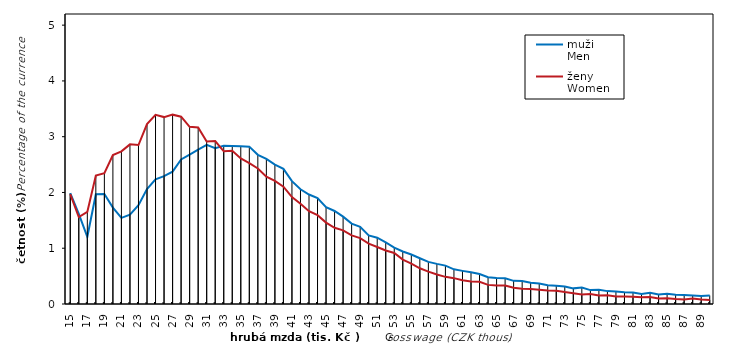
| Category | muži 
Men | ženy
Women |
|---|---|---|
| 15.0 | 1.989 | 1.971 |
| 16.0 | 1.617 | 1.56 |
| 17.0 | 1.205 | 1.65 |
| 18.0 | 1.969 | 2.303 |
| 19.0 | 1.972 | 2.347 |
| 20.0 | 1.729 | 2.669 |
| 21.0 | 1.545 | 2.736 |
| 22.0 | 1.601 | 2.863 |
| 23.0 | 1.771 | 2.851 |
| 24.0 | 2.062 | 3.226 |
| 25.0 | 2.234 | 3.391 |
| 26.0 | 2.291 | 3.351 |
| 27.0 | 2.374 | 3.395 |
| 28.0 | 2.591 | 3.358 |
| 29.0 | 2.679 | 3.177 |
| 30.0 | 2.769 | 3.166 |
| 31.0 | 2.855 | 2.915 |
| 32.0 | 2.792 | 2.921 |
| 33.0 | 2.836 | 2.738 |
| 34.0 | 2.833 | 2.747 |
| 35.0 | 2.828 | 2.609 |
| 36.0 | 2.821 | 2.527 |
| 37.0 | 2.675 | 2.43 |
| 38.0 | 2.601 | 2.283 |
| 39.0 | 2.501 | 2.206 |
| 40.0 | 2.423 | 2.105 |
| 41.0 | 2.203 | 1.917 |
| 42.0 | 2.058 | 1.798 |
| 43.0 | 1.964 | 1.665 |
| 44.0 | 1.899 | 1.594 |
| 45.0 | 1.736 | 1.459 |
| 46.0 | 1.668 | 1.367 |
| 47.0 | 1.567 | 1.32 |
| 48.0 | 1.441 | 1.231 |
| 49.0 | 1.385 | 1.181 |
| 50.0 | 1.23 | 1.083 |
| 51.0 | 1.189 | 1.023 |
| 52.0 | 1.105 | 0.96 |
| 53.0 | 1.01 | 0.915 |
| 54.0 | 0.942 | 0.796 |
| 55.0 | 0.887 | 0.724 |
| 56.0 | 0.82 | 0.64 |
| 57.0 | 0.756 | 0.581 |
| 58.0 | 0.72 | 0.53 |
| 59.0 | 0.688 | 0.487 |
| 60.0 | 0.622 | 0.464 |
| 61.0 | 0.594 | 0.425 |
| 62.0 | 0.569 | 0.404 |
| 63.0 | 0.538 | 0.397 |
| 64.0 | 0.48 | 0.343 |
| 65.0 | 0.466 | 0.333 |
| 66.0 | 0.462 | 0.333 |
| 67.0 | 0.415 | 0.292 |
| 68.0 | 0.412 | 0.272 |
| 69.0 | 0.382 | 0.271 |
| 70.0 | 0.366 | 0.256 |
| 71.0 | 0.335 | 0.243 |
| 72.0 | 0.328 | 0.237 |
| 73.0 | 0.315 | 0.214 |
| 74.0 | 0.28 | 0.195 |
| 75.0 | 0.296 | 0.172 |
| 76.0 | 0.249 | 0.18 |
| 77.0 | 0.254 | 0.154 |
| 78.0 | 0.231 | 0.156 |
| 79.0 | 0.225 | 0.135 |
| 80.0 | 0.212 | 0.134 |
| 81.0 | 0.207 | 0.13 |
| 82.0 | 0.18 | 0.123 |
| 83.0 | 0.2 | 0.126 |
| 84.0 | 0.172 | 0.1 |
| 85.0 | 0.185 | 0.104 |
| 86.0 | 0.165 | 0.089 |
| 87.0 | 0.162 | 0.079 |
| 88.0 | 0.154 | 0.1 |
| 89.0 | 0.144 | 0.081 |
| 90.0 | 0.153 | 0.074 |